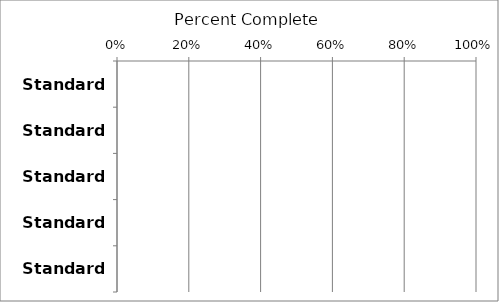
| Category | Series 0 |
|---|---|
| Standard 1 | 0 |
| Standard 2 | 0 |
| Standard 3 | 0 |
| Standard 4 | 0 |
| Standard 5 | 0 |